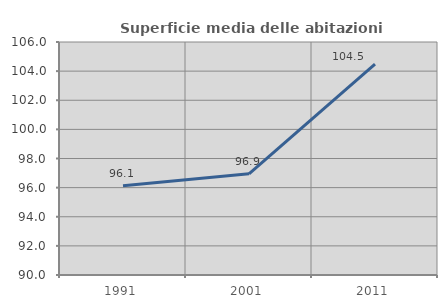
| Category | Superficie media delle abitazioni occupate |
|---|---|
| 1991.0 | 96.128 |
| 2001.0 | 96.945 |
| 2011.0 | 104.489 |